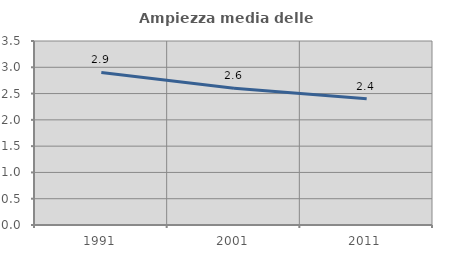
| Category | Ampiezza media delle famiglie |
|---|---|
| 1991.0 | 2.902 |
| 2001.0 | 2.6 |
| 2011.0 | 2.4 |